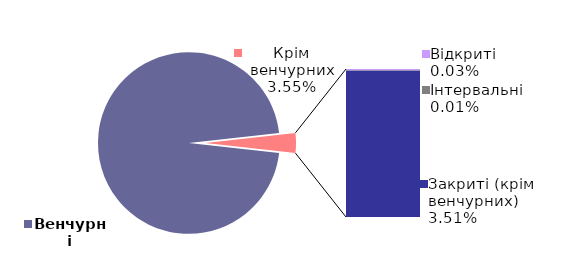
| Category | 30.09.2023 |
|---|---|
| Венчурні | 0.964 |
| Відкриті | 0 |
| Інтервальні | 0 |
| Закриті (крім венчурних) | 0.035 |